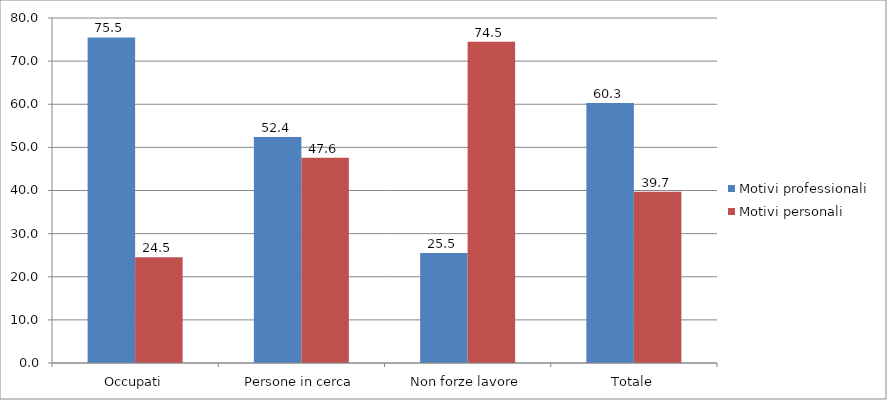
| Category | Motivi professionali | Motivi personali |
|---|---|---|
| Occupati | 75.5 | 24.511 |
| Persone in cerca | 52.404 | 47.596 |
| Non forze lavore | 25.5 | 74.49 |
| Totale | 60.3 | 39.711 |